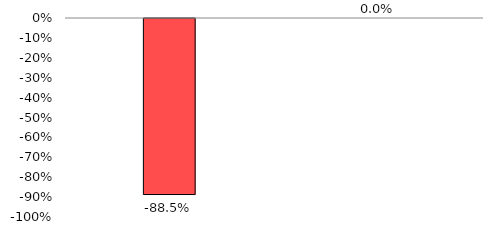
| Category | Series 1 |
|---|---|
| No of Current A/cs Opened Progressive | -0.885 |
| Number of Depositors Accounts (CASA) | 0 |